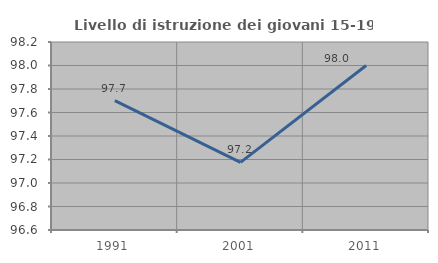
| Category | Livello di istruzione dei giovani 15-19 anni |
|---|---|
| 1991.0 | 97.701 |
| 2001.0 | 97.175 |
| 2011.0 | 98 |